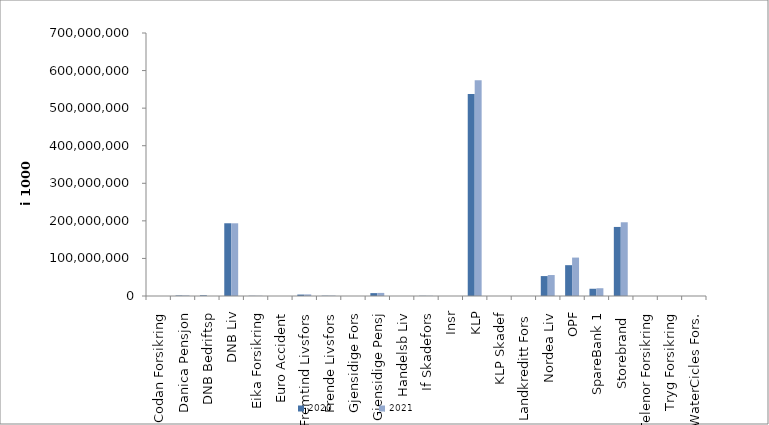
| Category | 2020 | 2021 |
|---|---|---|
| Codan Forsikring | 0 | 0 |
| Danica Pensjon | 1320149.652 | 1398802.868 |
| DNB Bedriftsp | 1799572 | 0 |
| DNB Liv | 193584584.224 | 193517916 |
| Eika Forsikring | 543598 | 572507 |
| Euro Accident | 0 | 0 |
| Fremtind Livsfors | 3822716.133 | 4274504.159 |
| Frende Livsfors | 790605 | 1050219 |
| Gjensidige Fors | 0 | 0 |
| Gjensidige Pensj | 7662525 | 8230173 |
| Handelsb Liv | 22414.323 | 22010.537 |
| If Skadefors | 513146.818 | 556565.278 |
| Insr | 2056 | 0 |
| KLP | 537548840.241 | 574122994.448 |
| KLP Skadef | 52996 | 72087.317 |
| Landkreditt Fors | 0 | 0 |
| Nordea Liv | 53026780 | 55808862 |
| OPF | 82047000 | 102259830 |
| SpareBank 1 | 19298850.996 | 20710069.297 |
| Storebrand  | 183812146.525 | 196253398.08 |
| Telenor Forsikring | 0 | 0 |
| Tryg Forsikring | 0 | 0 |
| WaterCicles Fors. | 0 | 0 |